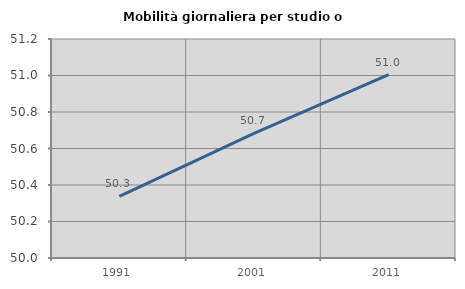
| Category | Mobilità giornaliera per studio o lavoro |
|---|---|
| 1991.0 | 50.338 |
| 2001.0 | 50.683 |
| 2011.0 | 51.005 |